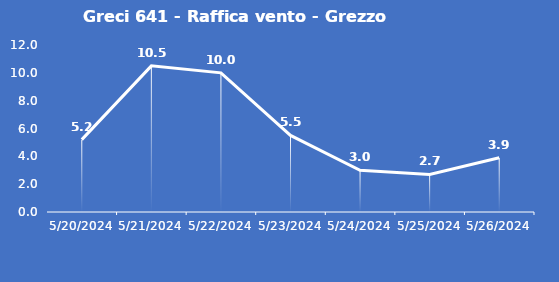
| Category | Greci 641 - Raffica vento - Grezzo (m/s) |
|---|---|
| 5/20/24 | 5.2 |
| 5/21/24 | 10.5 |
| 5/22/24 | 10 |
| 5/23/24 | 5.5 |
| 5/24/24 | 3 |
| 5/25/24 | 2.7 |
| 5/26/24 | 3.9 |